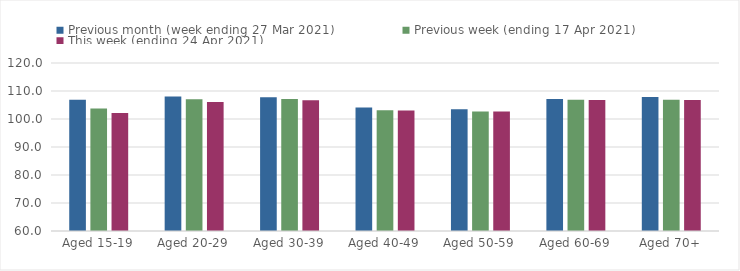
| Category | Previous month (week ending 27 Mar 2021) | Previous week (ending 17 Apr 2021) | This week (ending 24 Apr 2021) |
|---|---|---|---|
| Aged 15-19 | 106.91 | 103.72 | 102.14 |
| Aged 20-29 | 108.03 | 107.02 | 106.04 |
| Aged 30-39 | 107.75 | 107.12 | 106.66 |
| Aged 40-49 | 104.09 | 103.12 | 103.06 |
| Aged 50-59 | 103.51 | 102.65 | 102.69 |
| Aged 60-69 | 107.1 | 106.86 | 106.82 |
| Aged 70+ | 107.86 | 106.91 | 106.8 |